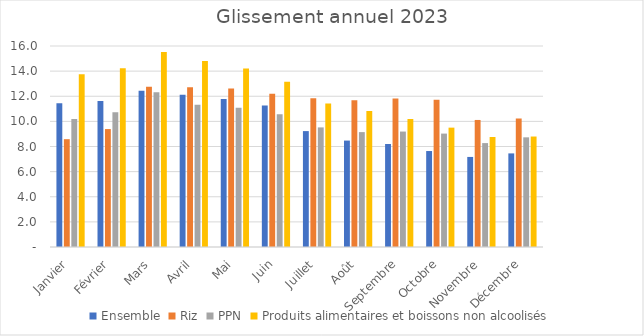
| Category | Ensemble | Riz | PPN | Produits alimentaires et boissons non alcoolisés |
|---|---|---|---|---|
| Janvier | 11.447 | 8.582 | 10.199 | 13.759 |
| Février | 11.631 | 9.387 | 10.729 | 14.221 |
| Mars | 12.433 | 12.748 | 12.316 | 15.515 |
| Avril | 12.111 | 12.71 | 11.332 | 14.814 |
| Mai | 11.786 | 12.623 | 11.094 | 14.215 |
| Juin | 11.258 | 12.19 | 10.576 | 13.156 |
| Juillet | 9.226 | 11.846 | 9.52 | 11.421 |
| Août | 8.472 | 11.678 | 9.145 | 10.825 |
| Septembre | 8.199 | 11.816 | 9.189 | 10.187 |
| Octobre | 7.639 | 11.714 | 9.027 | 9.502 |
| Novembre | 7.169 | 10.113 | 8.272 | 8.758 |
| Décembre | 7.451 | 10.22 | 8.729 | 8.794 |